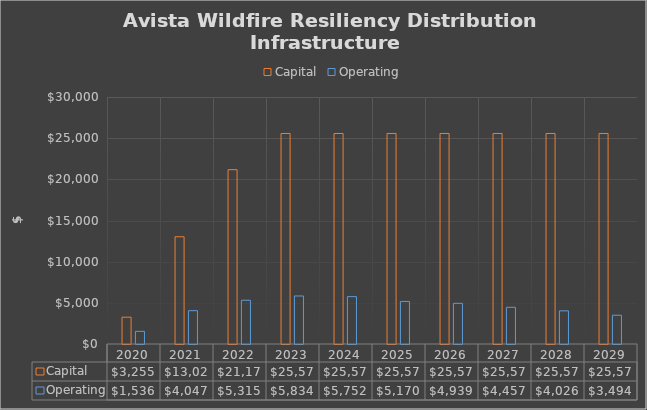
| Category | Capital | Operating |
|---|---|---|
| 2020.0 | 3255 | 1535.5 |
| 2021.0 | 13025 | 4046.7 |
| 2022.0 | 21170 | 5315.1 |
| 2023.0 | 25570 | 5833.5 |
| 2024.0 | 25570 | 5751.9 |
| 2025.0 | 25570 | 5170.3 |
| 2026.0 | 25570 | 4938.7 |
| 2027.0 | 25570 | 4457.1 |
| 2028.0 | 25570 | 4025.5 |
| 2029.0 | 25570 | 3494.4 |